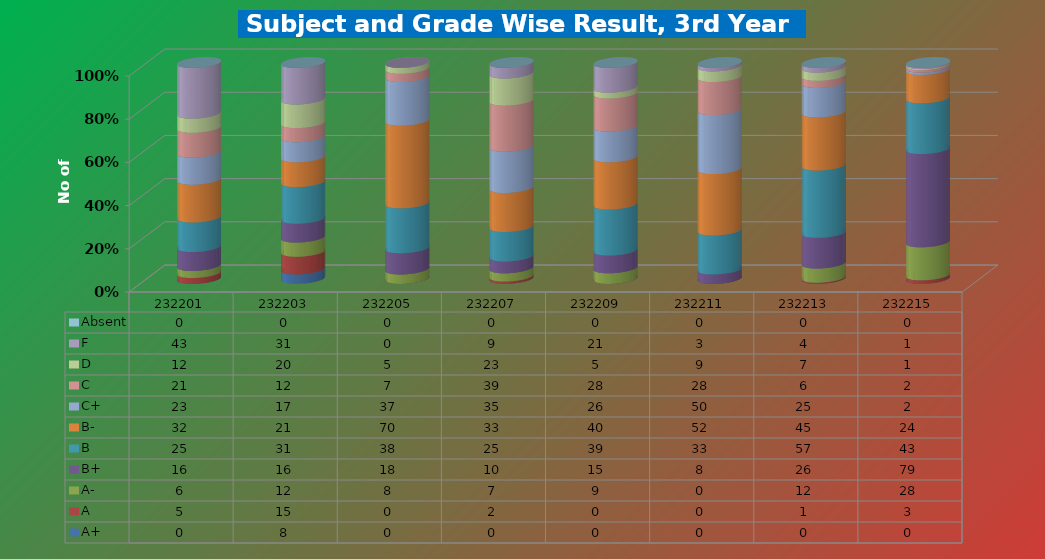
| Category | A+ | A | A- | B+ | B | B- | C+ | C | D | F | Absent |
|---|---|---|---|---|---|---|---|---|---|---|---|
| 232201.0 | 0 | 5 | 6 | 16 | 25 | 32 | 23 | 21 | 12 | 43 | 0 |
| 232203.0 | 8 | 15 | 12 | 16 | 31 | 21 | 17 | 12 | 20 | 31 | 0 |
| 232205.0 | 0 | 0 | 8 | 18 | 38 | 70 | 37 | 7 | 5 | 0 | 0 |
| 232207.0 | 0 | 2 | 7 | 10 | 25 | 33 | 35 | 39 | 23 | 9 | 0 |
| 232209.0 | 0 | 0 | 9 | 15 | 39 | 40 | 26 | 28 | 5 | 21 | 0 |
| 232211.0 | 0 | 0 | 0 | 8 | 33 | 52 | 50 | 28 | 9 | 3 | 0 |
| 232213.0 | 0 | 1 | 12 | 26 | 57 | 45 | 25 | 6 | 7 | 4 | 0 |
| 232215.0 | 0 | 3 | 28 | 79 | 43 | 24 | 2 | 2 | 1 | 1 | 0 |